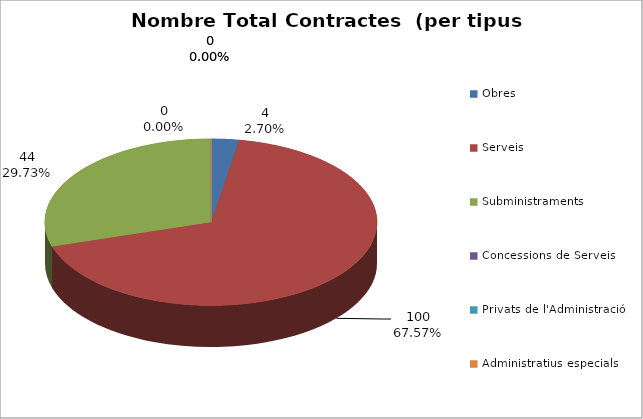
| Category | Nombre Total Contractes |
|---|---|
| Obres | 4 |
| Serveis | 100 |
| Subministraments | 44 |
| Concessions de Serveis | 0 |
| Privats de l'Administració | 0 |
| Administratius especials | 0 |